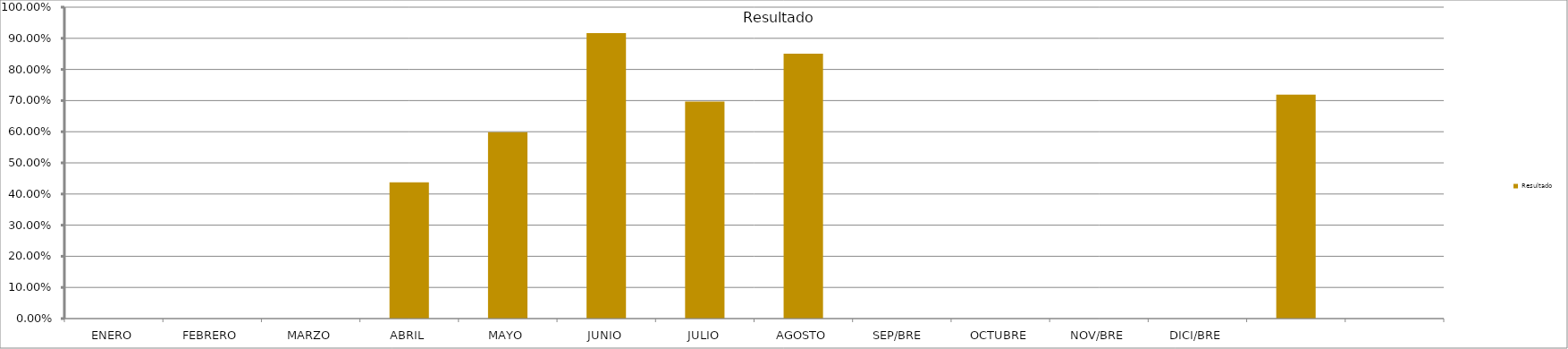
| Category | Resultado  |
|---|---|
| ENERO | 0 |
| FEBRERO | 0 |
| MARZO | 0 |
| ABRIL | 0.437 |
| MAYO | 0.599 |
| JUNIO | 0.917 |
| JULIO | 0.697 |
| AGOSTO | 0.851 |
| SEP/BRE  | 0 |
| OCTUBRE | 0 |
| NOV/BRE | 0 |
| DICI/BRE | 0 |